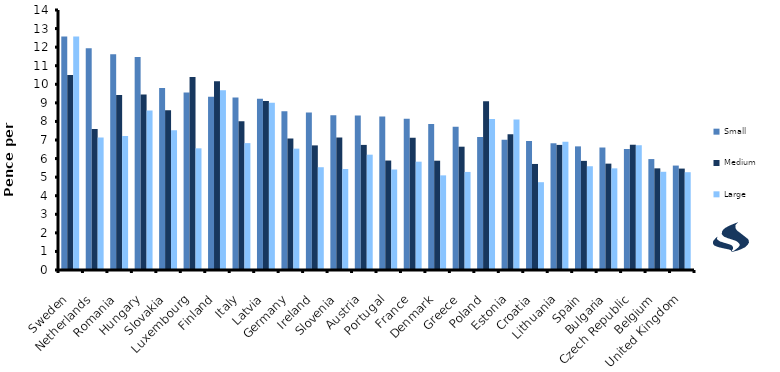
| Category | Small | Medium | Large |
|---|---|---|---|
| Sweden | 12.569 | 10.499 | 12.569 |
| Netherlands | 11.937 | 7.587 | 7.14 |
| Romania | 11.613 | 9.42 | 7.218 |
| Hungary | 11.464 | 9.446 | 8.587 |
| Slovakia | 9.806 | 8.595 | 7.525 |
| Luxembourg | 9.552 | 10.394 | 6.552 |
| Finland | 9.332 | 10.165 | 9.674 |
| Italy | 9.288 | 8.008 | 6.833 |
| Latvia | 9.218 | 9.104 | 9.008 |
| Germany | 8.543 | 7.087 | 6.534 |
| Ireland | 8.481 | 6.71 | 5.534 |
| Slovenia | 8.332 | 7.14 | 5.438 |
| Austria | 8.324 | 6.736 | 6.21 |
| Portugal | 8.271 | 5.894 | 5.412 |
| France | 8.148 | 7.122 | 5.833 |
| Denmark | 7.859 | 5.885 | 5.096 |
| Greece | 7.71 | 6.64 | 5.28 |
| Poland | 7.166 | 9.087 | 8.131 |
| Estonia | 7.017 | 7.315 | 8.104 |
| Croatia | 6.947 | 5.71 | 4.728 |
| Lithuania | 6.824 | 6.736 | 6.911 |
| Spain | 6.657 | 5.876 | 5.587 |
| Bulgaria | 6.596 | 5.727 | 5.473 |
| Czech Republic | 6.517 | 6.745 | 6.719 |
| Belgium | 5.973 | 5.473 | 5.289 |
| United Kingdom | 5.623 | 5.461 | 5.266 |